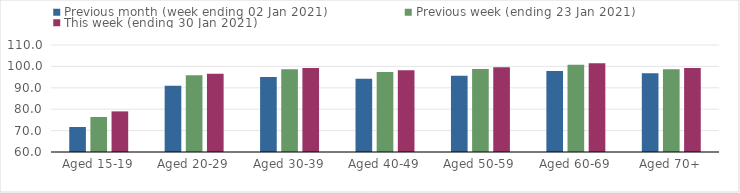
| Category | Previous month (week ending 02 Jan 2021) | Previous week (ending 23 Jan 2021) | This week (ending 30 Jan 2021) |
|---|---|---|---|
| Aged 15-19 | 71.67 | 76.36 | 78.98 |
| Aged 20-29 | 91.01 | 95.81 | 96.51 |
| Aged 30-39 | 95.08 | 98.65 | 99.27 |
| Aged 40-49 | 94.25 | 97.35 | 98.21 |
| Aged 50-59 | 95.67 | 98.84 | 99.64 |
| Aged 60-69 | 97.87 | 100.76 | 101.48 |
| Aged 70+ | 96.81 | 98.63 | 99.29 |